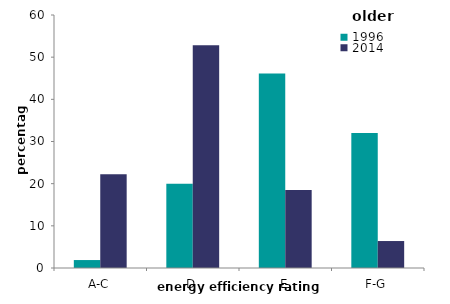
| Category | 1996 | 2014 |
|---|---|---|
| A-C | 1.886 | 22.248 |
| D | 19.968 | 52.847 |
| E | 46.155 | 18.509 |
| F-G | 31.991 | 6.396 |